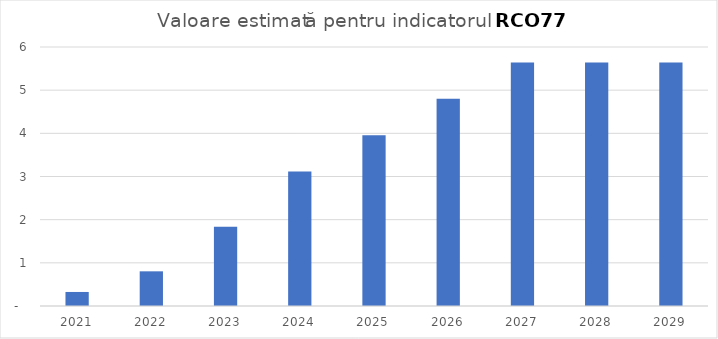
| Category | Series 0 |
|---|---|
| 2021.0 | 0.325 |
| 2022.0 | 0.803 |
| 2023.0 | 1.836 |
| 2024.0 | 3.117 |
| 2025.0 | 3.958 |
| 2026.0 | 4.799 |
| 2027.0 | 5.641 |
| 2028.0 | 5.641 |
| 2029.0 | 5.641 |